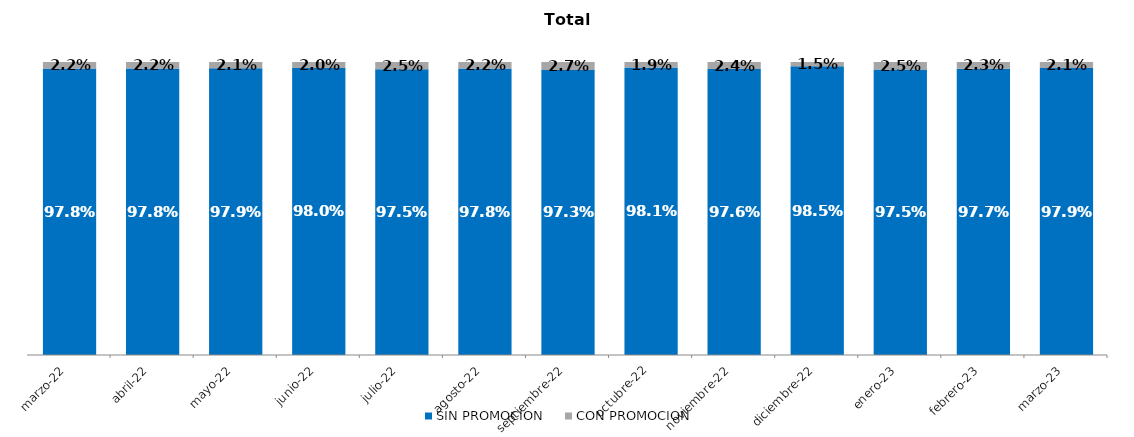
| Category | SIN PROMOCION   | CON PROMOCION   |
|---|---|---|
| 2022-03-01 | 0.978 | 0.022 |
| 2022-04-01 | 0.978 | 0.022 |
| 2022-05-01 | 0.979 | 0.021 |
| 2022-06-01 | 0.98 | 0.02 |
| 2022-07-01 | 0.975 | 0.025 |
| 2022-08-01 | 0.978 | 0.022 |
| 2022-09-01 | 0.973 | 0.027 |
| 2022-10-01 | 0.981 | 0.019 |
| 2022-11-01 | 0.976 | 0.024 |
| 2022-12-01 | 0.985 | 0.015 |
| 2023-01-01 | 0.975 | 0.025 |
| 2023-02-01 | 0.977 | 0.023 |
| 2023-03-01 | 0.979 | 0.021 |